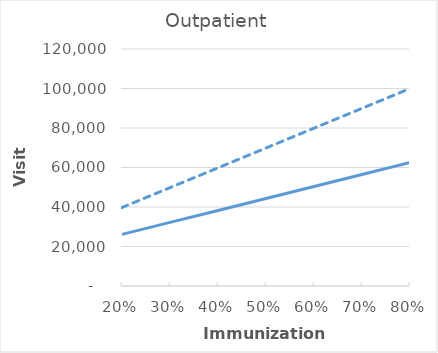
| Category | Low Efficacy, Low RSV Rates | High Efficacy, High RSV Rates |
|---|---|---|
| 0.2 | 26150.296 | 39754.313 |
| 0.30000000000000004 | 32209.062 | 49795.295 |
| 0.4 | 38267.829 | 59836.277 |
| 0.5 | 44326.595 | 69877.258 |
| 0.6 | 50385.361 | 79918.24 |
| 0.7 | 56444.128 | 89959.222 |
| 0.7999999999999999 | 62502.894 | 100000.204 |